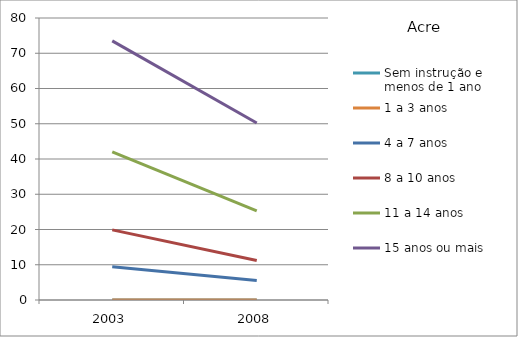
| Category | Sem instrução e menos de 1 ano | 1 a 3 anos | 4 a 7 anos | 8 a 10 anos | 11 a 14 anos | 15 anos ou mais |
|---|---|---|---|---|---|---|
| 2003.0 | 0 | 0 | 9.4 | 19.9 | 42 | 73.5 |
| 2008.0 | 0 | 0 | 5.5 | 11.2 | 25.3 | 50.2 |